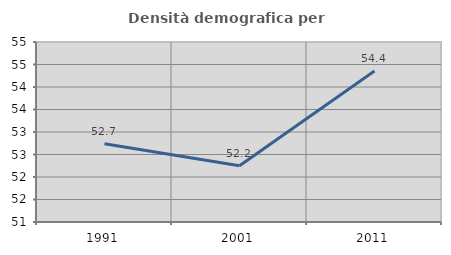
| Category | Densità demografica |
|---|---|
| 1991.0 | 52.739 |
| 2001.0 | 52.249 |
| 2011.0 | 54.355 |